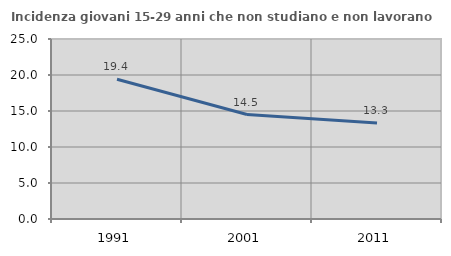
| Category | Incidenza giovani 15-29 anni che non studiano e non lavorano  |
|---|---|
| 1991.0 | 19.413 |
| 2001.0 | 14.508 |
| 2011.0 | 13.333 |